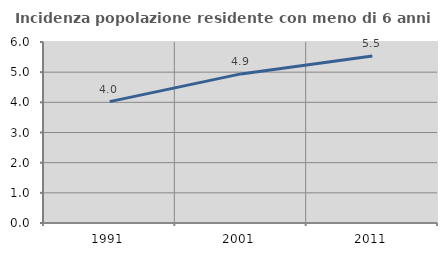
| Category | Incidenza popolazione residente con meno di 6 anni |
|---|---|
| 1991.0 | 4.023 |
| 2001.0 | 4.943 |
| 2011.0 | 5.532 |